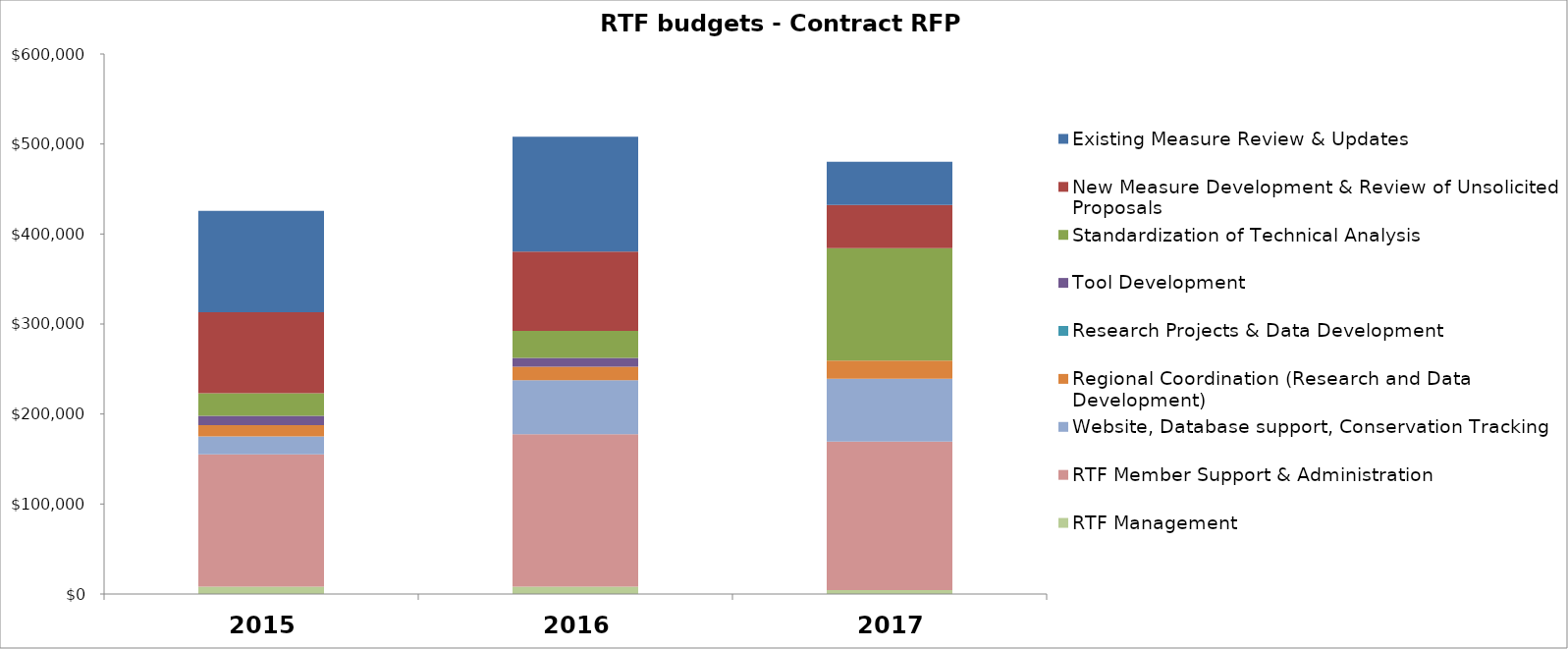
| Category | RTF Management | RTF Member Support & Administration | Website, Database support, Conservation Tracking  | Regional Coordination (Research and Data Development) | Research Projects & Data Development | Tool Development | Standardization of Technical Analysis | New Measure Development & Review of Unsolicited Proposals | Existing Measure Review & Updates |
|---|---|---|---|---|---|---|---|---|---|
| 0 | 8300 | 146800 | 20000 | 12500 | 0 | 10500 | 25000 | 90000 | 112500 |
| 1 | 8300 | 169200 | 60000 | 15000 | 0 | 10000 | 30000 | 88000 | 127500 |
| 2 | 4300 | 165000 | 70000 | 20000 | 0 | 0 | 125000 | 48000 | 48000 |